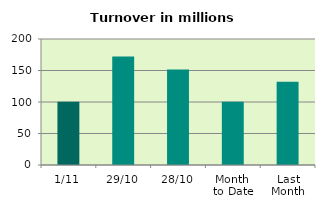
| Category | Series 0 |
|---|---|
| 1/11 | 100.538 |
| 29/10 | 172.026 |
| 28/10 | 151.727 |
| Month 
to Date | 100.538 |
| Last
Month | 132.268 |